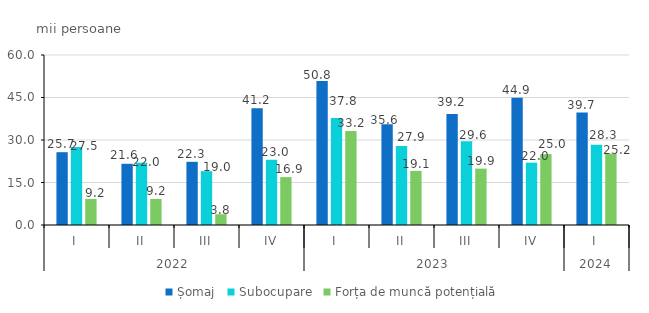
| Category | Șomaj | Subocupare | Forța de muncă potențială |
|---|---|---|---|
| 0 | 25.7 | 27.5 | 9.2 |
| 1 | 21.6 | 22 | 9.2 |
| 2 | 22.3 | 19 | 3.8 |
| 3 | 41.2 | 23 | 16.9 |
| 4 | 50.8 | 37.8 | 33.2 |
| 5 | 35.6 | 27.9 | 19.1 |
| 6 | 39.2 | 29.6 | 19.9 |
| 7 | 44.9 | 22 | 25 |
| 8 | 39.7 | 28.3 | 25.2 |